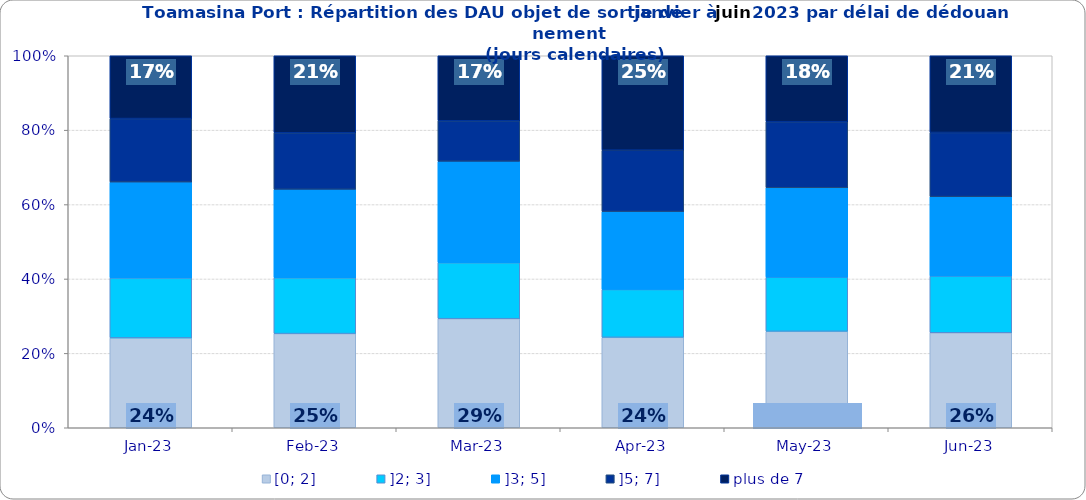
| Category | [0; 2] | ]2; 3] | ]3; 5] | ]5; 7] | plus de 7 |
|---|---|---|---|---|---|
| 2023-01-01 | 0.242 | 0.161 | 0.258 | 0.171 | 0.169 |
| 2023-02-01 | 0.253 | 0.15 | 0.238 | 0.152 | 0.207 |
| 2023-03-01 | 0.293 | 0.151 | 0.272 | 0.109 | 0.175 |
| 2023-04-01 | 0.243 | 0.129 | 0.209 | 0.165 | 0.254 |
| 2023-05-01 | 0.259 | 0.146 | 0.24 | 0.178 | 0.177 |
| 2023-06-01 | 0.255 | 0.152 | 0.213 | 0.173 | 0.206 |